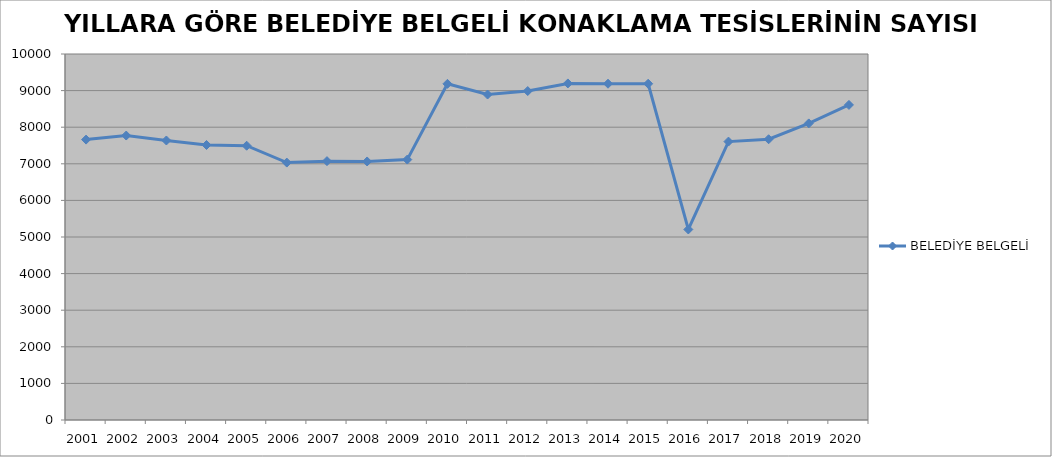
| Category | BELEDİYE BELGELİ |
|---|---|
| 2001 | 7661 |
| 2002 | 7772 |
| 2003 | 7637 |
| 2004 | 7514 |
| 2005 | 7494 |
| 2006 | 7033 |
| 2007 | 7073 |
| 2008 | 7064 |
| 2009 | 7115 |
| 2010 | 9185 |
| 2011 | 8893 |
| 2012 | 8988 |
| 2013 | 9196 |
| 2014 | 9188 |
| 2015 | 9187 |
| 2016 | 5206 |
| 2017 | 7607 |
| 2018 | 7671 |
| 2019 | 8104 |
| 2020 | 8609 |